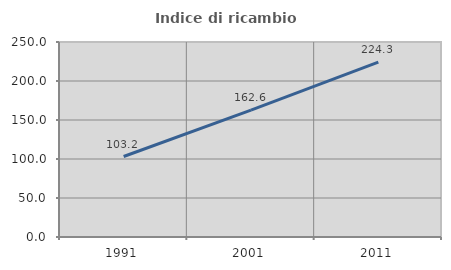
| Category | Indice di ricambio occupazionale  |
|---|---|
| 1991.0 | 103.187 |
| 2001.0 | 162.632 |
| 2011.0 | 224.277 |